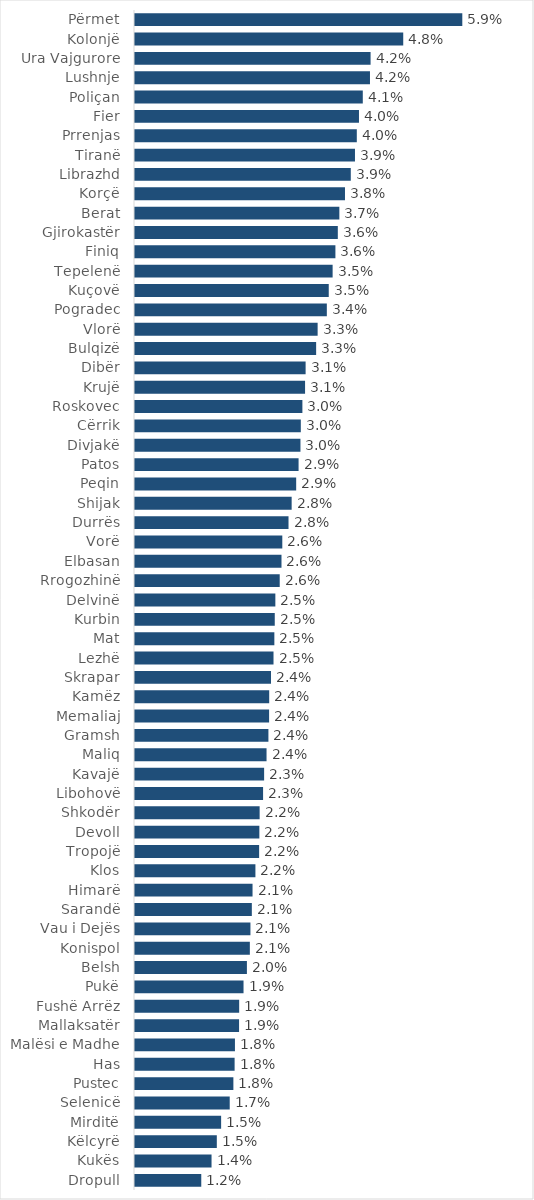
| Category | Pavlefshmëria në % |
|---|---|
| Përmet | 0.059 |
| Kolonjë | 0.048 |
| Ura Vajgurore | 0.042 |
| Lushnje | 0.042 |
| Poliçan | 0.041 |
| Fier | 0.04 |
| Prrenjas | 0.04 |
| Tiranë | 0.039 |
| Librazhd | 0.039 |
| Korçë | 0.038 |
| Berat | 0.037 |
| Gjirokastër | 0.036 |
| Finiq | 0.036 |
| Tepelenë | 0.035 |
| Kuçovë | 0.035 |
| Pogradec | 0.034 |
| Vlorë | 0.033 |
| Bulqizë | 0.033 |
| Dibër | 0.031 |
| Krujë | 0.031 |
| Roskovec | 0.03 |
| Cërrik | 0.03 |
| Divjakë | 0.03 |
| Patos | 0.029 |
| Peqin | 0.029 |
| Shijak | 0.028 |
| Durrës | 0.028 |
| Vorë | 0.026 |
| Elbasan | 0.026 |
| Rrogozhinë | 0.026 |
| Delvinë | 0.025 |
| Kurbin | 0.025 |
| Mat | 0.025 |
| Lezhë | 0.025 |
| Skrapar | 0.024 |
| Kamëz | 0.024 |
| Memaliaj | 0.024 |
| Gramsh | 0.024 |
| Maliq | 0.024 |
| Kavajë | 0.023 |
| Libohovë | 0.023 |
| Shkodër | 0.022 |
| Devoll | 0.022 |
| Tropojë | 0.022 |
| Klos | 0.022 |
| Himarë | 0.021 |
| Sarandë | 0.021 |
| Vau i Dejës | 0.021 |
| Konispol | 0.021 |
| Belsh | 0.02 |
| Pukë | 0.019 |
| Fushë Arrëz | 0.019 |
| Mallaksatër | 0.019 |
| Malësi e Madhe | 0.018 |
| Has | 0.018 |
| Pustec | 0.018 |
| Selenicë | 0.017 |
| Mirditë | 0.015 |
| Këlcyrë | 0.015 |
| Kukës | 0.014 |
| Dropull | 0.012 |